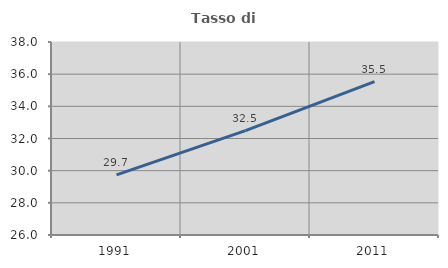
| Category | Tasso di occupazione   |
|---|---|
| 1991.0 | 29.735 |
| 2001.0 | 32.494 |
| 2011.0 | 35.538 |